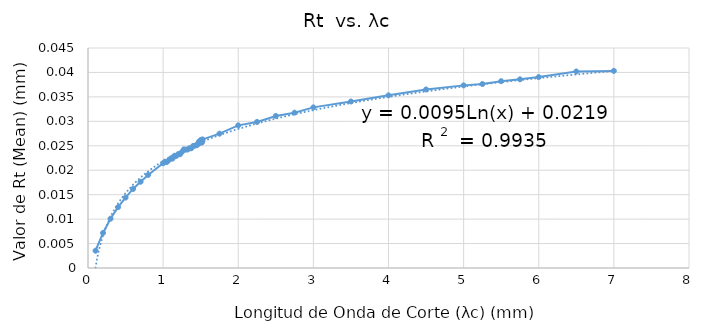
| Category | Rt mean |
|---|---|
| 0.1 | 0.004 |
| 0.2 | 0.007 |
| 0.3 | 0.01 |
| 0.4 | 0.012 |
| 0.5 | 0.014 |
| 0.6 | 0.016 |
| 0.7 | 0.018 |
| 0.8 | 0.019 |
| 1.0 | 0.021 |
| 1.025 | 0.022 |
| 1.05 | 0.022 |
| 1.075 | 0.022 |
| 1.1 | 0.022 |
| 1.125 | 0.022 |
| 1.15 | 0.023 |
| 1.175 | 0.023 |
| 1.2 | 0.023 |
| 1.225 | 0.023 |
| 1.25 | 0.024 |
| 1.275 | 0.024 |
| 1.3 | 0.024 |
| 1.325 | 0.024 |
| 1.35 | 0.024 |
| 1.375 | 0.024 |
| 1.4 | 0.025 |
| 1.425 | 0.025 |
| 1.45 | 0.025 |
| 1.465 | 0.025 |
| 1.475 | 0.026 |
| 1.48 | 0.026 |
| 1.485 | 0.026 |
| 1.495 | 0.026 |
| 1.5 | 0.026 |
| 1.505 | 0.026 |
| 1.51 | 0.026 |
| 1.515 | 0.026 |
| 1.52 | 0.026 |
| 1.525 | 0.026 |
| 1.75 | 0.027 |
| 2.0 | 0.029 |
| 2.25 | 0.03 |
| 2.5 | 0.031 |
| 2.75 | 0.032 |
| 3.0 | 0.033 |
| 3.5 | 0.034 |
| 4.0 | 0.035 |
| 4.5 | 0.037 |
| 5.0 | 0.037 |
| 5.25 | 0.038 |
| 5.5 | 0.038 |
| 5.75 | 0.039 |
| 6.0 | 0.039 |
| 6.5 | 0.04 |
| 7.0 | 0.04 |